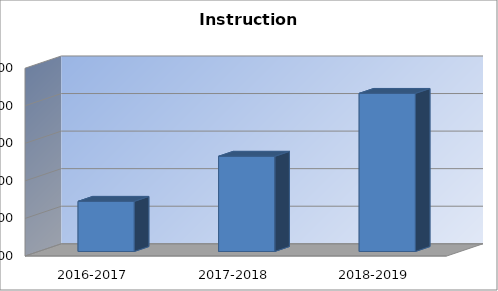
| Category | Instruction Expenditures |
|---|---|
| 2016-2017 | 1533442 |
| 2017-2018 | 1653406 |
| 2018-2019 | 1820880 |